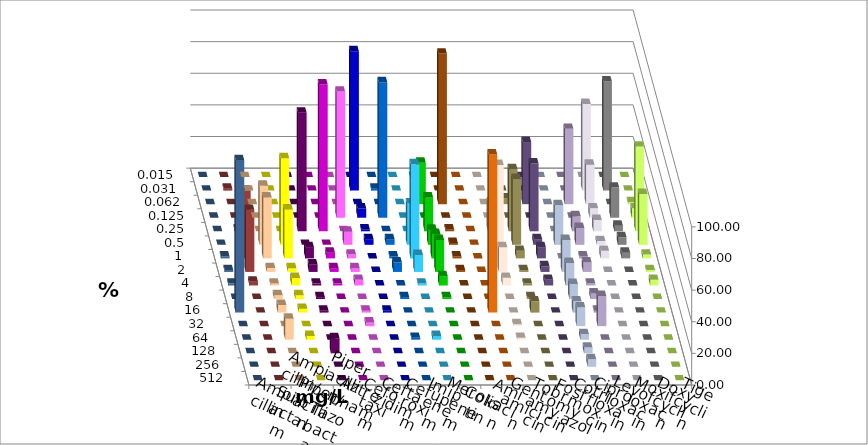
| Category | Ampicillin | Ampicillin/ Sulbactam | Piperacillin | Piperacillin/ Tazobactam | Aztreonam | Cefotaxim | Ceftazidim | Cefuroxim | Imipenem | Meropenem | Colistin | Amikacin | Gentamicin | Tobramycin | Fosfomycin | Cotrimoxazol | Ciprofloxacin | Levofloxacin | Moxifloxacin | Doxycyclin | Tigecyclin |
|---|---|---|---|---|---|---|---|---|---|---|---|---|---|---|---|---|---|---|---|---|---|
| 0.015 | 0 | 0 | 0 | 0 | 0 | 0 | 0 | 0 | 0 | 0 | 0 | 0 | 0 | 0 | 0 | 0 | 0 | 0 | 0 | 0 | 0 |
| 0.031 | 0 | 0 | 0 | 0 | 0 | 88.095 | 1.19 | 0 | 0 | 0 | 0 | 0 | 0 | 0 | 0 | 0 | 54.762 | 69.048 | 0 | 0 | 1.19 |
| 0.062 | 0 | 0 | 0 | 0 | 0 | 0 | 0 | 0 | 26.19 | 95.238 | 0 | 0 | 3.571 | 39.286 | 0 | 47.619 | 25 | 0 | 1.19 | 0 | 0 |
| 0.125 | 0 | 0 | 0 | 0 | 79.762 | 5.952 | 85.714 | 0 | 0 | 0 | 0 | 0 | 0 | 0 | 0 | 0 | 5.952 | 19.048 | 5.952 | 0 | 0 |
| 0.25 | 0 | 0 | 75 | 92.857 | 0 | 1.19 | 0 | 0 | 21.429 | 1.19 | 0 | 18.072 | 39.286 | 42.857 | 0 | 9.524 | 7.143 | 3.571 | 53.571 | 0 | 1.19 |
| 0.5 | 37.349 | 54.762 | 0 | 0 | 8.333 | 3.571 | 3.571 | 26.19 | 9.524 | 1.19 | 0 | 0 | 41.667 | 3.571 | 25 | 10.714 | 2.381 | 4.762 | 32.143 | 0 | 13.095 |
| 1.0 | 38.554 | 30.952 | 7.143 | 3.571 | 2.381 | 0 | 1.19 | 59.524 | 15.476 | 1.19 | 0 | 59.036 | 4.762 | 7.143 | 0 | 1.19 | 4.762 | 3.571 | 2.381 | 1.19 | 42.857 |
| 2.0 | 2.41 | 2.381 | 4.762 | 2.381 | 2.381 | 0 | 5.952 | 10.714 | 20.238 | 1.19 | 0 | 15.663 | 1.19 | 3.571 | 20.238 | 5.952 | 0 | 0 | 1.19 | 1.19 | 39.286 |
| 4.0 | 1.205 | 4.762 | 1.19 | 1.19 | 3.571 | 0 | 0 | 1.19 | 5.952 | 0 | 0 | 4.819 | 1.19 | 3.571 | 14.286 | 1.19 | 0 | 0 | 3.571 | 1.19 | 2.381 |
| 8.0 | 2.41 | 2.381 | 1.19 | 0 | 0 | 0 | 1.19 | 0 | 1.19 | 0 | 0 | 0 | 1.19 | 0 | 9.524 | 3.571 | 0 | 0 | 0 | 0 | 0 |
| 16.0 | 4.819 | 2.381 | 1.19 | 0 | 1.19 | 1.19 | 0 | 0 | 0 | 0 | 100 | 0 | 7.143 | 0 | 7.143 | 1.19 | 0 | 0 | 0 | 96.429 | 0 |
| 32.0 | 0 | 0 | 0 | 0 | 2.381 | 0 | 0 | 0 | 0 | 0 | 0 | 1.205 | 0 | 0 | 11.905 | 19.048 | 0 | 0 | 0 | 0 | 0 |
| 64.0 | 13.253 | 2.381 | 0 | 0 | 0 | 0 | 1.19 | 2.381 | 0 | 0 | 0 | 1.205 | 0 | 0 | 3.571 | 0 | 0 | 0 | 0 | 0 | 0 |
| 128.0 | 0 | 0 | 9.524 | 0 | 0 | 0 | 0 | 0 | 0 | 0 | 0 | 0 | 0 | 0 | 3.571 | 0 | 0 | 0 | 0 | 0 | 0 |
| 256.0 | 0 | 0 | 0 | 0 | 0 | 0 | 0 | 0 | 0 | 0 | 0 | 0 | 0 | 0 | 4.762 | 0 | 0 | 0 | 0 | 0 | 0 |
| 512.0 | 0 | 0 | 0 | 0 | 0 | 0 | 0 | 0 | 0 | 0 | 0 | 0 | 0 | 0 | 0 | 0 | 0 | 0 | 0 | 0 | 0 |